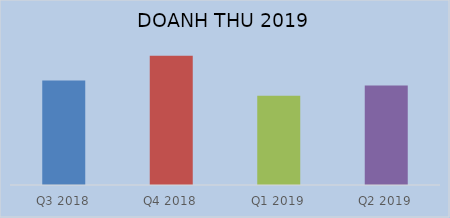
| Category | Doanh thu thuần |
|---|---|
| Q3 2018 | 4321432694079 |
| Q4 2018 | 5347312864829 |
| Q1 2019 | 3696941658891 |
| Q2 2019 | 4113456512184 |